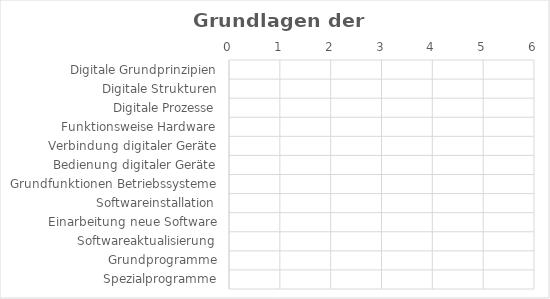
| Category | Grundlagen der Digitalisierung |
|---|---|
| Digitale Grundprinzipien | 0 |
| Digitale Strukturen | 0 |
| Digitale Prozesse | 0 |
| Funktionsweise Hardware | 0 |
| Verbindung digitaler Geräte | 0 |
| Bedienung digitaler Geräte | 0 |
| Grundfunktionen Betriebssysteme | 0 |
| Softwareinstallation | 0 |
| Einarbeitung neue Software | 0 |
| Softwareaktualisierung | 0 |
| Grundprogramme | 0 |
| Spezialprogramme | 0 |